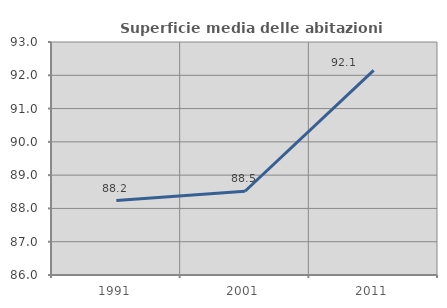
| Category | Superficie media delle abitazioni occupate |
|---|---|
| 1991.0 | 88.236 |
| 2001.0 | 88.517 |
| 2011.0 | 92.148 |